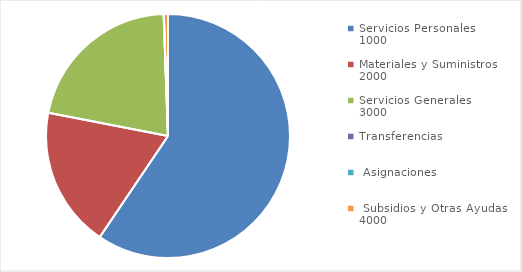
| Category | Importe |
|---|---|
| 0 | 8515232713.38 |
| 1 | 2663617378.56 |
| 2 | 3062319440.94 |
| 3 | 1398761 |
| 4 | 1787025 |
| 5 | 78706855 |